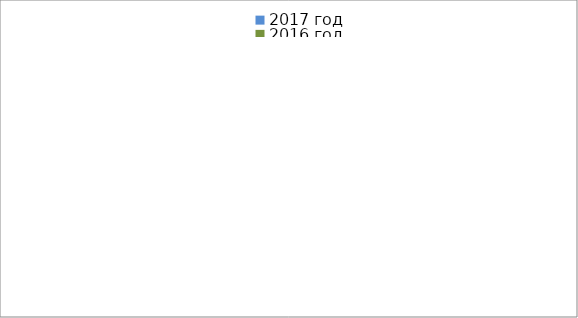
| Category | 2017 год | 2016 год |
|---|---|---|
|  - поджог | 9 | 26 |
|  - неосторожное обращение с огнём | 4 | 17 |
|  - НПТЭ электрооборудования | 11 | 10 |
|  - НПУ и Э печей | 26 | 26 |
|  - НПУ и Э транспортных средств | 34 | 15 |
|   -Шалость с огнем детей | 3 | 5 |
|  -НППБ при эксплуатации эл.приборов | 19 | 5 |
|  - курение | 21 | 7 |
| - прочие | 46 | 56 |
| - не установленные причины | 0 | 11 |